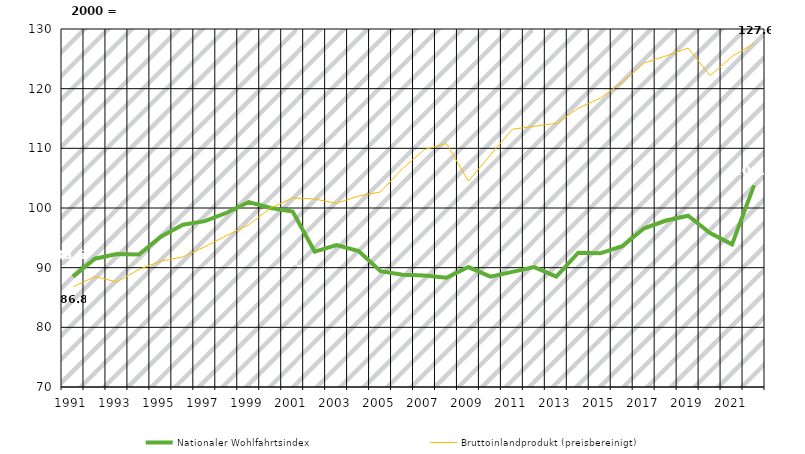
| Category | Nationaler Wohlfahrtsindex | Bruttoinlandprodukt (preisbereinigt) |
|---|---|---|
| 1991.0 | 88.5 | 86.8 |
| 1992.0 | 91.5 | 88.5 |
| 1993.0 | 92.3 | 87.6 |
| 1994.0 | 92.2 | 89.7 |
| 1995.0 | 95.2 | 91.1 |
| 1996.0 | 97.2 | 91.8 |
| 1997.0 | 97.8 | 93.5 |
| 1998.0 | 99.2 | 95.4 |
| 1999.0 | 101 | 97.2 |
| 2000.0 | 100 | 100 |
| 2001.0 | 99.4 | 101.7 |
| 2002.0 | 92.7 | 101.5 |
| 2003.0 | 93.8 | 100.8 |
| 2004.0 | 92.8 | 102 |
| 2005.0 | 89.4 | 102.7 |
| 2006.0 | 88.8 | 106.6 |
| 2007.0 | 88.7 | 109.8 |
| 2008.0 | 88.3 | 110.8 |
| 2009.0 | 90.1 | 104.5 |
| 2010.0 | 88.5 | 108.9 |
| 2011.0 | 89.3 | 113.2 |
| 2012.0 | 90.1 | 113.7 |
| 2013.0 | 88.5 | 114.2 |
| 2014.0 | 92.5 | 116.7 |
| 2015.0 | 92.4 | 118.4 |
| 2016.0 | 93.6 | 121.1 |
| 2017.0 | 96.6 | 124.3 |
| 2018.0 | 97.9 | 125.5 |
| 2019.0 | 98.7 | 126.8 |
| 2020.0 | 95.8 | 122.2 |
| 2021.0 | 93.9 | 125.4 |